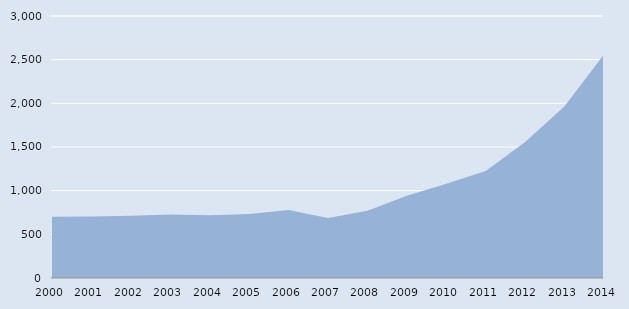
| Category | Series 0 |
|---|---|
| 2000.0 | 701 |
| 2001.0 | 704 |
| 2002.0 | 713 |
| 2003.0 | 726 |
| 2004.0 | 718 |
| 2005.0 | 733 |
| 2006.0 | 779 |
| 2007.0 | 687 |
| 2008.0 | 769 |
| 2009.0 | 941 |
| 2010.0 | 1079 |
| 2011.0 | 1226 |
| 2012.0 | 1557 |
| 2013.0 | 1967 |
| 2014.0 | 2560 |